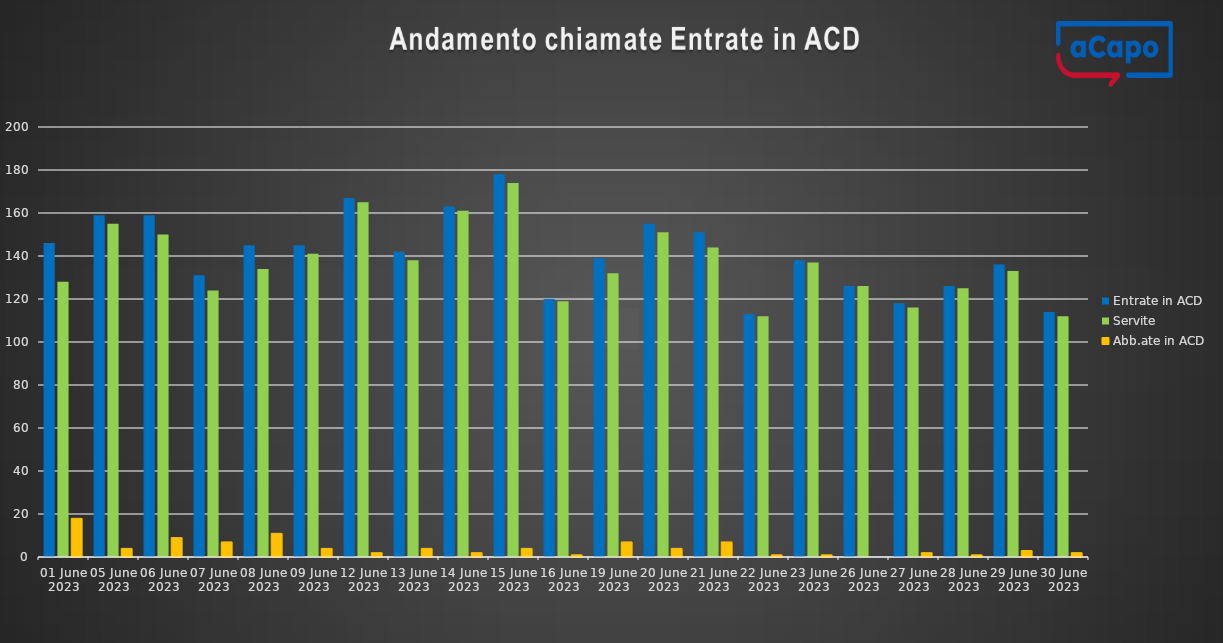
| Category | Entrate in ACD | Servite | Abb.ate in ACD |
|---|---|---|---|
| 2023-06-01 | 146 | 128 | 18 |
| 2023-06-05 | 159 | 155 | 4 |
| 2023-06-06 | 159 | 150 | 9 |
| 2023-06-07 | 131 | 124 | 7 |
| 2023-06-08 | 145 | 134 | 11 |
| 2023-06-09 | 145 | 141 | 4 |
| 2023-06-12 | 167 | 165 | 2 |
| 2023-06-13 | 142 | 138 | 4 |
| 2023-06-14 | 163 | 161 | 2 |
| 2023-06-15 | 178 | 174 | 4 |
| 2023-06-16 | 120 | 119 | 1 |
| 2023-06-19 | 139 | 132 | 7 |
| 2023-06-20 | 155 | 151 | 4 |
| 2023-06-21 | 151 | 144 | 7 |
| 2023-06-22 | 113 | 112 | 1 |
| 2023-06-23 | 138 | 137 | 1 |
| 2023-06-26 | 126 | 126 | 0 |
| 2023-06-27 | 118 | 116 | 2 |
| 2023-06-28 | 126 | 125 | 1 |
| 2023-06-29 | 136 | 133 | 3 |
| 2023-06-30 | 114 | 112 | 2 |